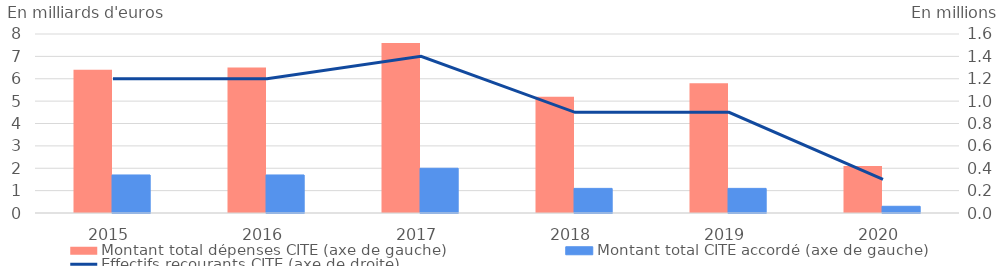
| Category | Montant total dépenses CITE (axe de gauche) | Montant total CITE accordé (axe de gauche) |
|---|---|---|
| 2015.0 | 6.4 | 1.7 |
| 2016.0 | 6.5 | 1.7 |
| 2017.0 | 7.6 | 2 |
| 2018.0 | 5.2 | 1.1 |
| 2019.0 | 5.8 | 1.1 |
| 2020.0 | 2.1 | 0.3 |